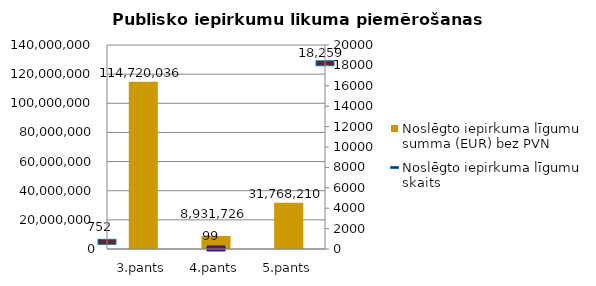
| Category | Noslēgto iepirkuma līgumu summa (EUR) bez PVN |
|---|---|
| 3.pants | 114720036 |
| 4.pants | 8931726 |
| 5.pants | 31768210 |